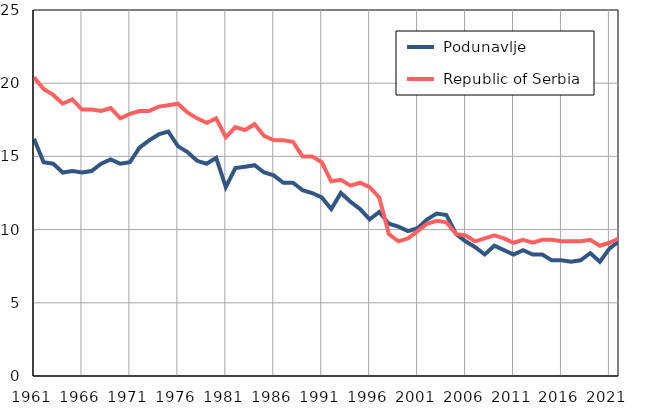
| Category |  Podunavlje |  Republic of Serbia |
|---|---|---|
| 1961.0 | 16.2 | 20.4 |
| 1962.0 | 14.6 | 19.6 |
| 1963.0 | 14.5 | 19.2 |
| 1964.0 | 13.9 | 18.6 |
| 1965.0 | 14 | 18.9 |
| 1966.0 | 13.9 | 18.2 |
| 1967.0 | 14 | 18.2 |
| 1968.0 | 14.5 | 18.1 |
| 1969.0 | 14.8 | 18.3 |
| 1970.0 | 14.5 | 17.6 |
| 1971.0 | 14.6 | 17.9 |
| 1972.0 | 15.6 | 18.1 |
| 1973.0 | 16.1 | 18.1 |
| 1974.0 | 16.5 | 18.4 |
| 1975.0 | 16.7 | 18.5 |
| 1976.0 | 15.7 | 18.6 |
| 1977.0 | 15.3 | 18 |
| 1978.0 | 14.7 | 17.6 |
| 1979.0 | 14.5 | 17.3 |
| 1980.0 | 14.9 | 17.6 |
| 1981.0 | 12.9 | 16.3 |
| 1982.0 | 14.2 | 17 |
| 1983.0 | 14.3 | 16.8 |
| 1984.0 | 14.4 | 17.2 |
| 1985.0 | 13.9 | 16.4 |
| 1986.0 | 13.7 | 16.1 |
| 1987.0 | 13.2 | 16.1 |
| 1988.0 | 13.2 | 16 |
| 1989.0 | 12.7 | 15 |
| 1990.0 | 12.5 | 15 |
| 1991.0 | 12.2 | 14.6 |
| 1992.0 | 11.4 | 13.3 |
| 1993.0 | 12.5 | 13.4 |
| 1994.0 | 11.9 | 13 |
| 1995.0 | 11.4 | 13.2 |
| 1996.0 | 10.7 | 12.9 |
| 1997.0 | 11.2 | 12.2 |
| 1998.0 | 10.4 | 9.7 |
| 1999.0 | 10.2 | 9.2 |
| 2000.0 | 9.9 | 9.4 |
| 2001.0 | 10.1 | 9.9 |
| 2002.0 | 10.7 | 10.4 |
| 2003.0 | 11.1 | 10.6 |
| 2004.0 | 11 | 10.5 |
| 2005.0 | 9.7 | 9.7 |
| 2006.0 | 9.2 | 9.6 |
| 2007.0 | 8.8 | 9.2 |
| 2008.0 | 8.3 | 9.4 |
| 2009.0 | 8.9 | 9.6 |
| 2010.0 | 8.6 | 9.4 |
| 2011.0 | 8.3 | 9.1 |
| 2012.0 | 8.6 | 9.3 |
| 2013.0 | 8.3 | 9.1 |
| 2014.0 | 8.3 | 9.3 |
| 2015.0 | 7.9 | 9.3 |
| 2016.0 | 7.9 | 9.2 |
| 2017.0 | 7.8 | 9.2 |
| 2018.0 | 7.9 | 9.2 |
| 2019.0 | 8.4 | 9.3 |
| 2020.0 | 7.8 | 8.9 |
| 2021.0 | 8.7 | 9.1 |
| 2022.0 | 9.2 | 9.4 |